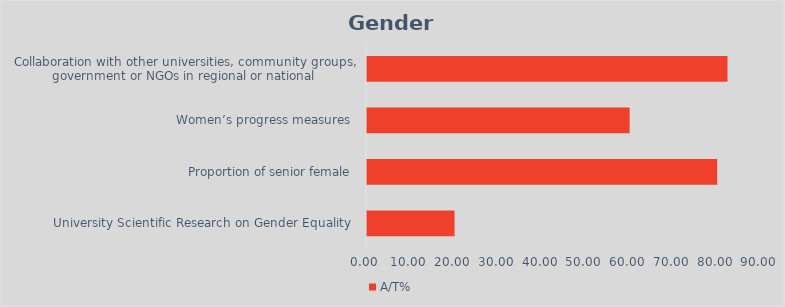
| Category | A/T% |
|---|---|
| University Scientific Research on Gender Equality  | 20 |
| Proportion of senior female  | 80 |
| Women’s progress measures  | 60 |
| Collaboration with other universities, community groups, government or NGOs in regional or national  | 82.353 |